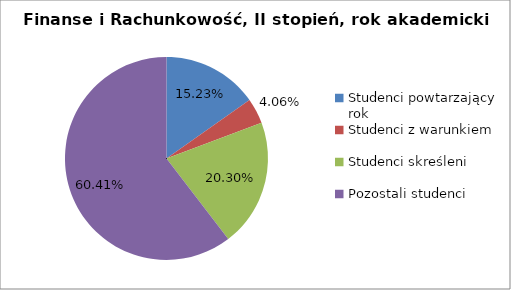
| Category | Series 0 |
|---|---|
| Studenci powtarzający rok | 30 |
| Studenci z warunkiem | 8 |
| Studenci skreśleni | 40 |
| Pozostali studenci | 119 |